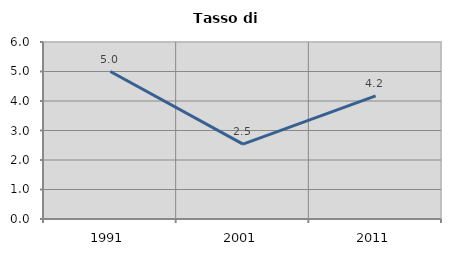
| Category | Tasso di disoccupazione   |
|---|---|
| 1991.0 | 5 |
| 2001.0 | 2.539 |
| 2011.0 | 4.172 |